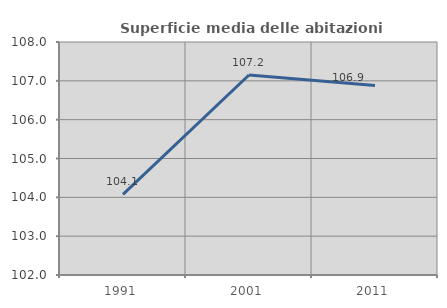
| Category | Superficie media delle abitazioni occupate |
|---|---|
| 1991.0 | 104.077 |
| 2001.0 | 107.151 |
| 2011.0 | 106.878 |